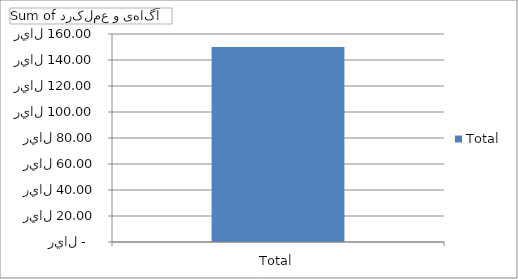
| Category | Total |
|---|---|
| Total | 150 |